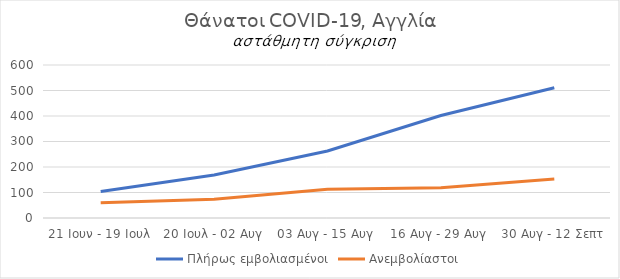
| Category | Πλήρως εμβολιασμένοι | Ανεμβολίαστοι |
|---|---|---|
| 21 Ιουν - 19 Ιουλ | 104 | 60 |
| 20 Ιουλ - 02 Αυγ | 169 | 74 |
| 03 Αυγ - 15 Αυγ | 263 | 113 |
| 16 Αυγ - 29 Αυγ | 402 | 119 |
| 30 Αυγ - 12 Σεπτ | 511 | 153 |